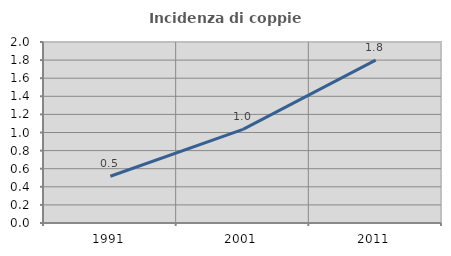
| Category | Incidenza di coppie miste |
|---|---|
| 1991.0 | 0.517 |
| 2001.0 | 1.034 |
| 2011.0 | 1.801 |